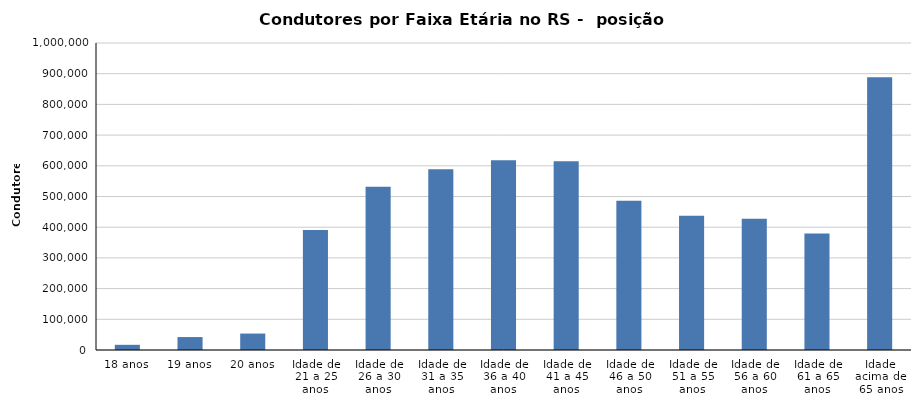
| Category | Condutores |
|---|---|
| 18 anos | 16868 |
| 19 anos | 42103 |
| 20 anos | 53568 |
| Idade de 21 a 25 anos | 390916 |
| Idade de 26 a 30 anos | 531799 |
| Idade de 31 a 35 anos | 588589 |
| Idade de 36 a 40 anos | 618300 |
| Idade de 41 a 45 anos | 615227 |
| Idade de 46 a 50 anos | 485958 |
| Idade de 51 a 55 anos | 437585 |
| Idade de 56 a 60 anos | 427150 |
| Idade de 61 a 65 anos | 379194 |
| Idade acima de 65 anos | 888243 |